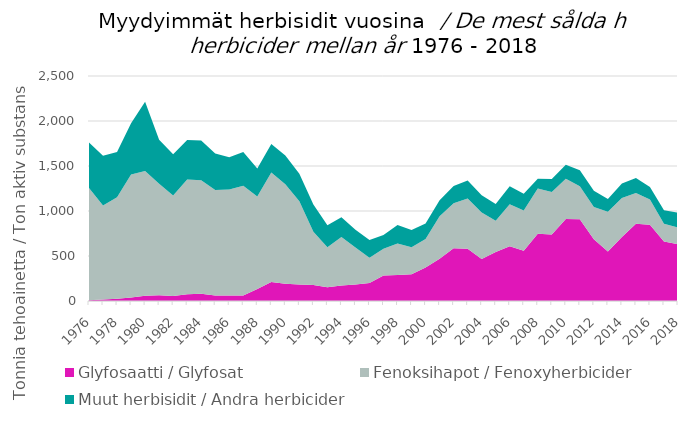
| Category | Glyfosaatti / Glyfosat | Fenoksihapot / Fenoxyherbicider  | Muut herbisidit / Andra herbicider |
|---|---|---|---|
| 1976.0 | 9.55 | 1244.9 | 507.45 |
| 1977.0 | 15.7 | 1044.4 | 552.5 |
| 1978.0 | 25.2 | 1126.8 | 504.6 |
| 1979.0 | 39.9 | 1366.4 | 569 |
| 1980.0 | 59.4 | 1385.8 | 767.7 |
| 1981.0 | 63.1 | 1239 | 489 |
| 1982.0 | 56.9 | 1116.6 | 456.5 |
| 1983.0 | 76.2 | 1274.9 | 436.5 |
| 1984.0 | 79.4 | 1262.2 | 440.9 |
| 1985.0 | 62.2 | 1170.8 | 405.7 |
| 1986.0 | 62.3 | 1177.4 | 358 |
| 1987.0 | 60.7 | 1218.5 | 375.3 |
| 1988.0 | 133.7 | 1027.4 | 311.5 |
| 1989.0 | 212.5 | 1216 | 316.8 |
| 1990.0 | 190.3 | 1106.8 | 320.3 |
| 1991.0 | 183.6 | 923.8 | 306.1 |
| 1992.0 | 179.1 | 589.1 | 303.5 |
| 1993.0 | 153.5 | 445 | 244.3 |
| 1994.0 | 171.36 | 539.1 | 218.74 |
| 1995.0 | 184.22 | 411.3 | 195.88 |
| 1996.0 | 198.99 | 281.4 | 196.91 |
| 1997.0 | 284.67 | 295.8 | 153.43 |
| 1998.0 | 288.5 | 349.6 | 205.8 |
| 1999.0 | 297.19 | 300.4 | 192.61 |
| 2000.0 | 372.59 | 317.1 | 172.71 |
| 2001.0 | 468.82 | 473.5 | 177.78 |
| 2002.0 | 585.63 | 500.3 | 191.87 |
| 2003.0 | 581.103 | 558.7 | 199.597 |
| 2004.0 | 466.6 | 516.9 | 190.8 |
| 2005.0 | 543.2 | 347.5 | 186.6 |
| 2006.0 | 609.1 | 464.8 | 200.2 |
| 2007.0 | 557.4 | 447 | 186.8 |
| 2008.0 | 748.5 | 500.5 | 108.2 |
| 2009.0 | 738.8 | 473.7 | 142.6 |
| 2010.0 | 912.1 | 447.4 | 155.7 |
| 2011.0 | 908.1 | 366.4 | 177.6 |
| 2012.0 | 687.5 | 355.9 | 180.4 |
| 2013.0 | 549.5 | 442.8 | 140.6 |
| 2014.0 | 710.2 | 434.8 | 160.7 |
| 2015.0 | 859.3 | 339.8 | 168.844 |
| 2016.0 | 847.7 | 279.087 | 138.613 |
| 2017.0 | 661.2 | 197.9 | 148 |
| 2018.0 | 630.3 | 186.4 | 165.7 |